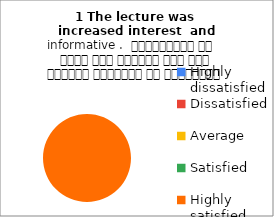
| Category | 1 The lecture was  increased interest  and informative .  व्याख्यान से रुचि में वृद्धि हुई एवं शिक्षण जानकारी से परिपूर्ण था |
|---|---|
| Highly dissatisfied | 0 |
| Dissatisfied | 0 |
| Average | 0 |
| Satisfied | 0 |
| Highly satisfied | 6 |